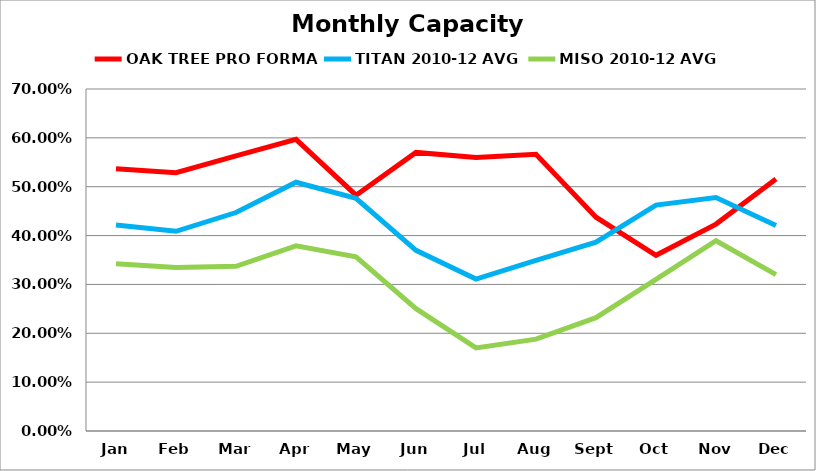
| Category | OAK TREE PRO FORMA | TITAN 2010-12 AVG | MISO 2010-12 AVG |
|---|---|---|---|
| 2011-01-01 | 0.537 | 0.422 | 0.342 |
| 2011-02-01 | 0.529 | 0.409 | 0.335 |
| 2011-03-01 | 0.563 | 0.447 | 0.337 |
| 2011-04-01 | 0.597 | 0.509 | 0.379 |
| 2011-05-01 | 0.483 | 0.476 | 0.356 |
| 2011-06-01 | 0.57 | 0.37 | 0.25 |
| 2011-07-01 | 0.56 | 0.311 | 0.17 |
| 2011-08-01 | 0.566 | 0.349 | 0.188 |
| 2011-09-01 | 0.438 | 0.386 | 0.232 |
| 2011-10-01 | 0.36 | 0.462 | 0.31 |
| 2011-11-01 | 0.423 | 0.478 | 0.389 |
| 2011-12-01 | 0.516 | 0.421 | 0.32 |